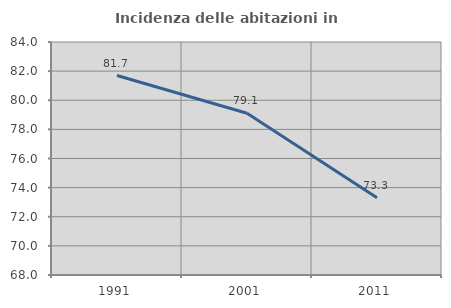
| Category | Incidenza delle abitazioni in proprietà  |
|---|---|
| 1991.0 | 81.698 |
| 2001.0 | 79.109 |
| 2011.0 | 73.306 |